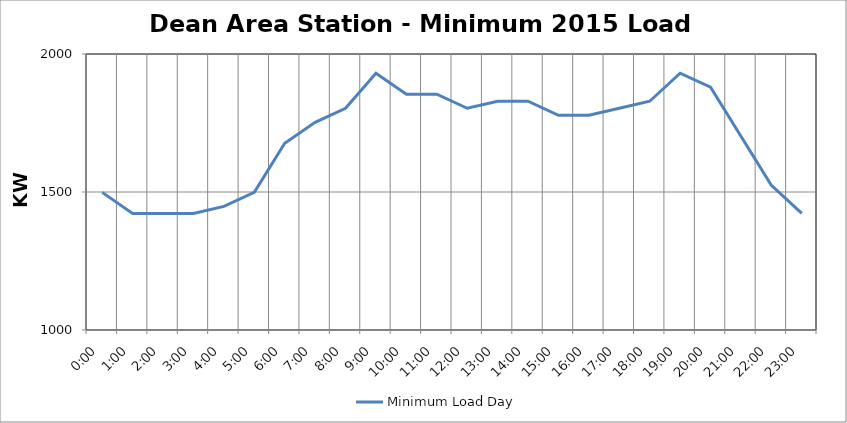
| Category | Minimum Load Day |
|---|---|
| 0.0 | 1498.6 |
| 0.041666666666666664 | 1422.4 |
| 0.08333333333333333 | 1422.4 |
| 0.125 | 1422.4 |
| 0.16666666666666666 | 1447.8 |
| 0.20833333333333334 | 1498.6 |
| 0.25 | 1676.4 |
| 0.2916666666666667 | 1752.6 |
| 0.3333333333333333 | 1803.4 |
| 0.375 | 1930.4 |
| 0.4166666666666667 | 1854.2 |
| 0.4583333333333333 | 1854.2 |
| 0.5 | 1803.4 |
| 0.5416666666666666 | 1828.8 |
| 0.5833333333333334 | 1828.8 |
| 0.625 | 1778 |
| 0.6666666666666666 | 1778 |
| 0.7083333333333334 | 1803.4 |
| 0.75 | 1828.8 |
| 0.7916666666666666 | 1930.4 |
| 0.8333333333333334 | 1879.6 |
| 0.875 | 1701.8 |
| 0.9166666666666666 | 1524 |
| 0.9583333333333334 | 1422.4 |